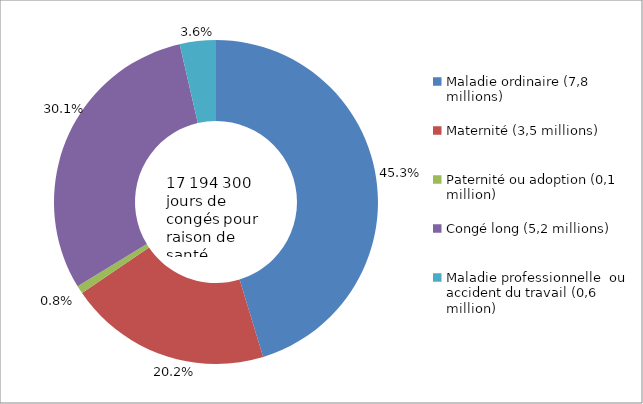
| Category | Series 0 |
|---|---|
| Maladie ordinaire (7,8 millions) | 0.453 |
| Maternité (3,5 millions) | 0.202 |
| Paternité ou adoption (0,1 million) | 0.008 |
| Congé long (5,2 millions) | 0.301 |
| Maladie professionnelle  ou accident du travail (0,6 million) | 0.036 |